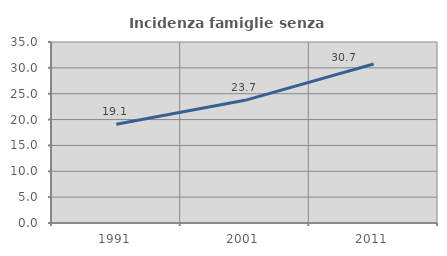
| Category | Incidenza famiglie senza nuclei |
|---|---|
| 1991.0 | 19.101 |
| 2001.0 | 23.72 |
| 2011.0 | 30.736 |